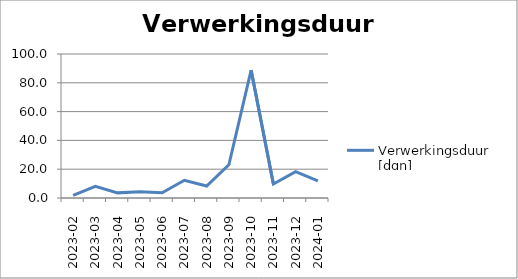
| Category | Verwerkingsduur [dgn] |
|---|---|
| 2023-02 | 1.878 |
| 2023-03 | 8.063 |
| 2023-04 | 3.563 |
| 2023-05 | 4.389 |
| 2023-06 | 3.596 |
| 2023-07 | 12.301 |
| 2023-08 | 8.327 |
| 2023-09 | 23.106 |
| 2023-10 | 88.789 |
| 2023-11 | 9.721 |
| 2023-12 | 18.274 |
| 2024-01 | 11.874 |